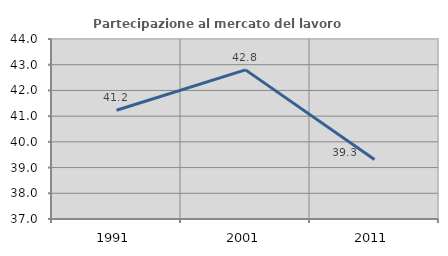
| Category | Partecipazione al mercato del lavoro  femminile |
|---|---|
| 1991.0 | 41.228 |
| 2001.0 | 42.8 |
| 2011.0 | 39.313 |